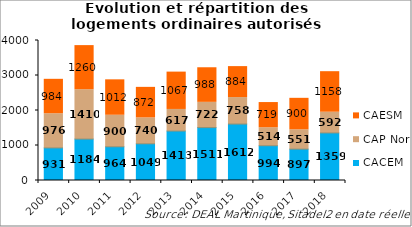
| Category | CACEM | CAP Nord | CAESM |
|---|---|---|---|
| 2009 | 931 | 976 | 984 |
| 2010 | 1184 | 1410 | 1260 |
| 2011 | 964 | 900 | 1012 |
| 2012 | 1049 | 740 | 872 |
| 2013 | 1413 | 617 | 1067 |
| 2014 | 1511 | 722 | 988 |
| 2015 | 1612 | 758 | 884 |
| 2016 | 994 | 514 | 719 |
| 2017 | 897 | 551 | 900 |
| 2018 | 1359 | 592 | 1158 |